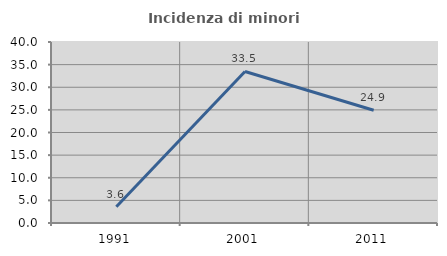
| Category | Incidenza di minori stranieri |
|---|---|
| 1991.0 | 3.571 |
| 2001.0 | 33.484 |
| 2011.0 | 24.923 |